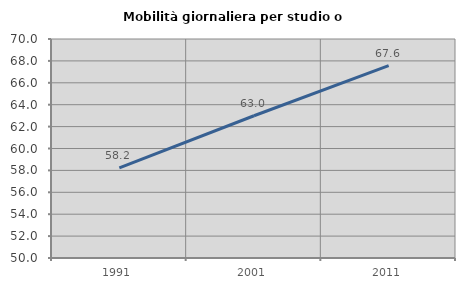
| Category | Mobilità giornaliera per studio o lavoro |
|---|---|
| 1991.0 | 58.24 |
| 2001.0 | 62.989 |
| 2011.0 | 67.563 |